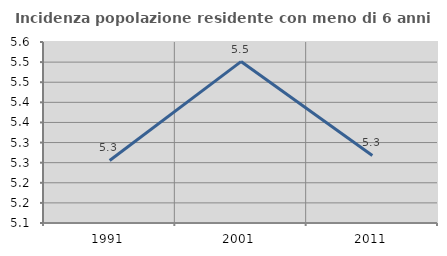
| Category | Incidenza popolazione residente con meno di 6 anni |
|---|---|
| 1991.0 | 5.255 |
| 2001.0 | 5.501 |
| 2011.0 | 5.268 |